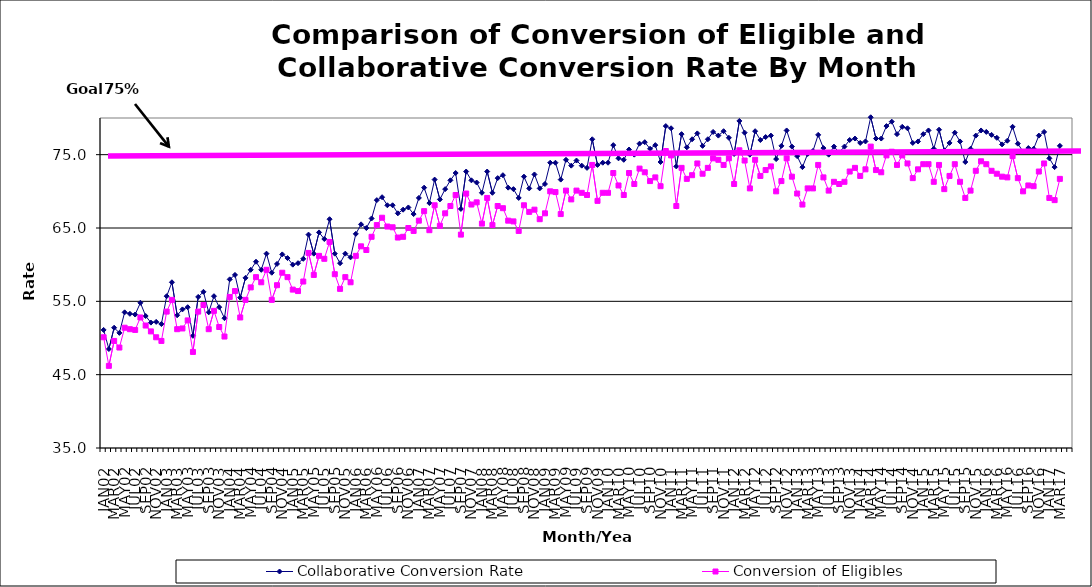
| Category | Collaborative Conversion Rate | Conversion of Eligibles |
|---|---|---|
| JAN02 | 51.1 | 50.1 |
| FEB02 | 48.5 | 46.2 |
| MAR02 | 51.4 | 49.6 |
| APR02 | 50.7 | 48.7 |
| MAY02 | 53.5 | 51.4 |
| JUN02 | 53.3 | 51.2 |
| JUL02 | 53.2 | 51.1 |
| AUG02 | 54.8 | 52.8 |
| SEP02 | 53 | 51.7 |
| OCT02 | 52.1 | 50.9 |
| NOV02 | 52.2 | 50.1 |
| DEC02 | 51.9 | 49.6 |
| JAN03 | 55.7 | 53.6 |
| FEB03 | 57.6 | 55.2 |
| MAR03 | 53.1 | 51.2 |
| APR03 | 53.9 | 51.3 |
| MAY03 | 54.2 | 52.4 |
| JUN03 | 50.3 | 48.1 |
| JUL03 | 55.6 | 53.6 |
| AUG03 | 56.3 | 54.5 |
| SEP03 | 53.5 | 51.2 |
| OCT03 | 55.7 | 53.7 |
| NOV03 | 54.2 | 51.5 |
| DEC03 | 52.7 | 50.2 |
| JAN04 | 58 | 55.6 |
| FEB04 | 58.6 | 56.4 |
| MAR04 | 55.5 | 52.8 |
| APR04 | 58.2 | 55.2 |
| MAY04 | 59.3 | 56.9 |
| JUN04 | 60.4 | 58.3 |
| JUL04 | 59.3 | 57.6 |
| AUG04 | 61.5 | 59.3 |
| SEP04 | 58.9 | 55.2 |
| OCT04 | 60.1 | 57.2 |
| NOV04 | 61.4 | 58.9 |
| DEC04 | 60.9 | 58.3 |
| JAN05 | 60 | 56.6 |
| FEB05 | 60.2 | 56.4 |
| MAR05 | 60.8 | 57.7 |
| APR05 | 64.1 | 61.6 |
| MAY05 | 61.5 | 58.6 |
| JUN05 | 64.4 | 61.2 |
| JUL05 | 63.5 | 60.8 |
| AUG05 | 66.2 | 63.1 |
| SEP05 | 61.5 | 58.7 |
| OCT05 | 60.2 | 56.7 |
| NOV05 | 61.5 | 58.3 |
| DEC05 | 61 | 57.6 |
| JAN06 | 64.2 | 61.2 |
| FEB06 | 65.5 | 62.5 |
| MAR06 | 65 | 62 |
| APR06 | 66.3 | 63.8 |
| MAY06 | 68.8 | 65.4 |
| JUN06 | 69.2 | 66.4 |
| JUL06 | 68.1 | 65.2 |
| AUG06 | 68.1 | 65.1 |
| SEP06 | 67 | 63.7 |
| OCT06 | 67.5 | 63.8 |
| NOV06 | 67.8 | 65 |
| DEC06 | 66.9 | 64.6 |
| JAN07 | 69.1 | 66 |
| FEB07 | 70.5 | 67.3 |
| MAR07 | 68.4 | 64.7 |
| APR07 | 71.6 | 68.1 |
| MAY07 | 68.9 | 65.3 |
| JUN07 | 70.3 | 67 |
| JUL07 | 71.5 | 68 |
| AUG07 | 72.5 | 69.5 |
| SEP07 | 67.6 | 64.1 |
| OCT07 | 72.7 | 69.7 |
| NOV07 | 71.5 | 68.2 |
| DEC07 | 71.2 | 68.5 |
| JAN08 | 69.8 | 65.6 |
| FEB08 | 72.7 | 69.1 |
| MAR08 | 69.8 | 65.4 |
| APR08 | 71.8 | 68 |
| MAY08 | 72.2 | 67.7 |
| JUN08 | 70.5 | 66 |
| JUL08 | 70.3 | 65.9 |
| AUG08 | 69.1 | 64.6 |
| SEP08 | 72 | 68.1 |
| OCT08 | 70.4 | 67.2 |
| NOV08 | 72.3 | 67.5 |
| DEC08 | 70.4 | 66.2 |
| JAN09 | 71 | 67 |
| FEB09 | 73.9 | 70 |
| MAR09 | 73.9 | 69.9 |
| APR09 | 71.6 | 66.9 |
| MAY09 | 74.3 | 70.1 |
| JUN09 | 73.5 | 68.9 |
| JUL09 | 74.2 | 70.1 |
| AUG09 | 73.5 | 69.8 |
| SEP09 | 73.2 | 69.5 |
| OCT09 | 77.1 | 73.6 |
| NOV09 | 73.6 | 68.7 |
| DEC09 | 73.9 | 69.8 |
| JAN10 | 73.9 | 69.8 |
| FEB10 | 76.3 | 72.5 |
| MAR10 | 74.5 | 70.8 |
| APR10 | 74.3 | 69.5 |
| MAY10 | 75.7 | 72.5 |
| JUN10 | 75 | 71 |
| JUL10 | 76.5 | 73.1 |
| AUG10 | 76.7 | 72.6 |
| SEP10 | 75.8 | 71.4 |
| OCT10 | 76.3 | 71.9 |
| NOV10 | 74 | 70.7 |
| DEC10 | 78.9 | 75.5 |
| JAN11 | 78.6 | 74.9 |
| FEB11 | 73.4 | 68 |
| MAR11 | 77.8 | 73.2 |
| APR11 | 76 | 71.7 |
| MAY11 | 77.1 | 72.2 |
| JUN11 | 77.9 | 73.8 |
| JUL11 | 76.2 | 72.4 |
| AUG11 | 77.1 | 73.2 |
| SEP11 | 78.1 | 74.5 |
| OCT11 | 77.6 | 74.3 |
| NOV11 | 78.2 | 73.6 |
| DEC11 | 77.3 | 74.5 |
| JAN12 | 75.1 | 71 |
| FEB12 | 79.6 | 75.6 |
| MAR12 | 78 | 74.2 |
| APR12 | 75 | 70.4 |
| MAY12 | 78.2 | 74.3 |
| JUN12 | 77 | 72.1 |
| JUL12 | 77.4 | 72.9 |
| AUG12 | 77.6 | 73.4 |
| SEP12 | 74.4 | 70 |
| OCT12 | 76.2 | 71.4 |
| NOV12 | 78.3 | 74.5 |
| DEC12 | 76.1 | 72 |
| JAN13 | 74.8 | 69.7 |
| FEB13 | 73.3 | 68.2 |
| MAR13 | 75.1 | 70.4 |
| APR13 | 75.5 | 70.4 |
| MAY13 | 77.7 | 73.6 |
| JUN13 | 75.9 | 71.9 |
| JUL13 | 75 | 70.1 |
| AUG13 | 76.1 | 71.3 |
| SEP13 | 75.3 | 71 |
| OCT13 | 76.1 | 71.3 |
| NOV13 | 77 | 72.7 |
| DEC13 | 77.2 | 73.2 |
| JAN14 | 76.6 | 72.1 |
| FEB14 | 76.8 | 73 |
| MAR14 | 80.1 | 76.1 |
| APR14 | 77.2 | 72.9 |
| MAY14 | 77.2 | 72.6 |
| JUN14 | 78.9 | 74.9 |
| JUL14 | 79.5 | 75.4 |
| AUG14 | 77.8 | 73.6 |
| SEP14 | 78.8 | 74.9 |
| OCT14 | 78.6 | 73.8 |
| NOV14 | 76.6 | 71.8 |
| DEC14 | 76.8 | 73 |
| JAN15 | 77.8 | 73.7 |
| FEB15 | 78.3 | 73.7 |
| MAR15 | 75.8 | 71.3 |
| APR15 | 78.4 | 73.6 |
| MAY15 | 75.6 | 70.3 |
| JUN15 | 76.6 | 72.1 |
| JUL15 | 78 | 73.7 |
| AUG15 | 76.8 | 71.3 |
| SEP15 | 74 | 69.1 |
| OCT15 | 75.8 | 70.1 |
| NOV15 | 77.6 | 72.8 |
| DEC15 | 78.3 | 74.1 |
| JAN16 | 78.1 | 73.7 |
| FEB16 | 77.7 | 72.8 |
| MAR16 | 77.3 | 72.4 |
| APR16 | 76.4 | 72 |
| MAY16 | 76.9 | 71.9 |
| JUN16 | 78.8 | 74.8 |
| JUL16 | 76.5 | 71.8 |
| AUG16 | 75.4 | 70 |
| SEP16 | 75.9 | 70.8 |
| OCT16 | 75.8 | 70.7 |
| NOV16 | 77.6 | 72.7 |
| DEC16 | 78.1 | 73.8 |
| JAN17 | 74.5 | 69.1 |
| FEB17 | 73.3 | 68.8 |
| MAR17 | 76.2 | 71.7 |